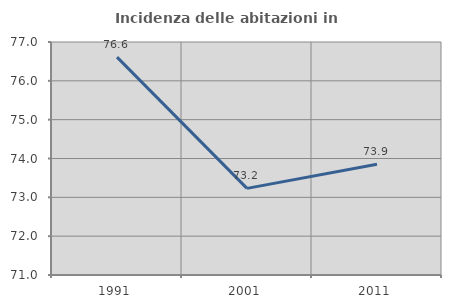
| Category | Incidenza delle abitazioni in proprietà  |
|---|---|
| 1991.0 | 76.61 |
| 2001.0 | 73.231 |
| 2011.0 | 73.851 |